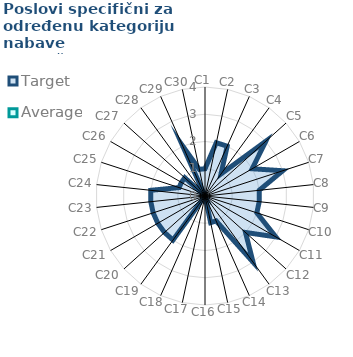
| Category | Target | Average |
|---|---|---|
| C1 | 1 | 0 |
| C2 | 2 | 0 |
| C3 | 2 | 0 |
| C4 | 1 | 0 |
| C5 | 3 | 0 |
| C6 | 2 | 0 |
| C7 | 3 | 0 |
| C8 | 2 | 0 |
| C9 | 2 | 0 |
| C10 | 2 | 0 |
| C11 | 3 | 0 |
| C12 | 2 | 0 |
| C13 | 3 | 0 |
| C14 | 1 | 0 |
| C15 | 1 | 0 |
| C16 | 0 | 0 |
| C17 | 0 | 0 |
| C18 | 0 | 0 |
| C19 | 2 | 0 |
| C20 | 2 | 0 |
| C21 | 2 | 0 |
| C22 | 2 | 0 |
| C23 | 2 | 0 |
| C24 | 2 | 0 |
| C25 | 1 | 0 |
| C26 | 1 | 0 |
| C27 | 1 | 0 |
| C28 | 0 | 0 |
| C29 | 2 | 0 |
| C30 | 1 | 0 |